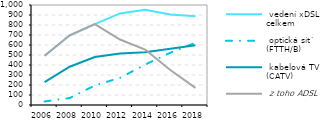
| Category |  vedení xDSL celkem |  optická sít´ (FTTH/B) |  kabelová TV (CATV) |  z toho ADSL |
|---|---|---|---|---|
| 2006.0 | 493.402 | 35.495 | 229.78 | 493.402 |
| 2008.0 | 697.172 | 70 | 382.512 | 697.172 |
| 2010.0 | 809.111 | 195.375 | 480.352 | 809.111 |
| 2012.0 | 915.707 | 271.804 | 516.128 | 654.665 |
| 2014.0 | 952.51 | 403.964 | 527.059 | 554.326 |
| 2016.0 | 904.355 | 522.552 | 563.274 | 350.175 |
| 2018.0 | 888.22 | 622.346 | 596.71 | 171.659 |